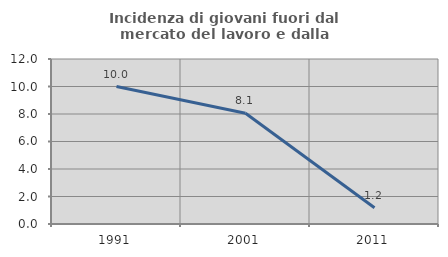
| Category | Incidenza di giovani fuori dal mercato del lavoro e dalla formazione  |
|---|---|
| 1991.0 | 10 |
| 2001.0 | 8.054 |
| 2011.0 | 1.176 |